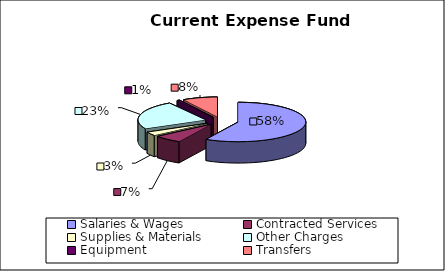
| Category | Series 0 |
|---|---|
| Salaries & Wages | 7031170700.01 |
| Contracted Services | 806331755.02 |
| Supplies & Materials | 375679242.96 |
| Other Charges | 2850946314.01 |
| Equipment | 75649374.54 |
| Transfers | 1011291275.256 |